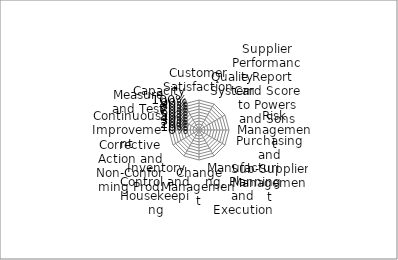
| Category | Series 0 | Series 1 |
|---|---|---|
| Customer Satisfaction | 0 | 0 |
| Quality System | 0 | 0 |
| Supplier Performance Report Card Score to Powers and Sons | 0 | 0 |
| Risk Management | 0 | 0 |
| Purchasing and Sub-Supplier Management | 0 | 0 |
| Manufacturing, Planning and Execution | 0 | 0 |
| Change Management | 0 | 0 |
| Inventory Control and Housekeeping | 0 | 0 |
| Corrective Action and Non-Conforming Prod. | 0 | 0 |
| Continuous Improvement | 0 | 0 |
| Measure and Test | 0 | 0 |
| Capacity | 0 | 0 |